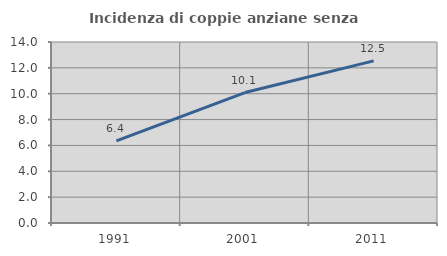
| Category | Incidenza di coppie anziane senza figli  |
|---|---|
| 1991.0 | 6.353 |
| 2001.0 | 10.088 |
| 2011.0 | 12.54 |